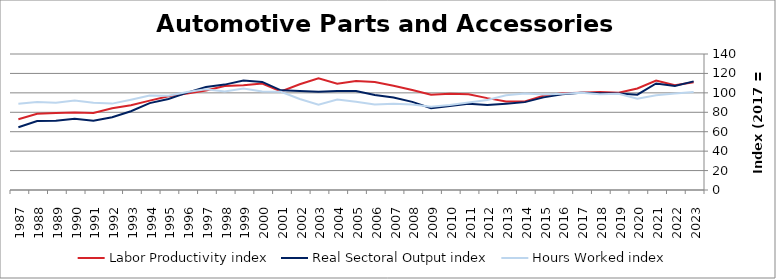
| Category | Labor Productivity index | Real Sectoral Output index | Hours Worked index |
|---|---|---|---|
| 2023.0 | 110.968 | 111.822 | 100.77 |
| 2022.0 | 107.852 | 107.166 | 99.364 |
| 2021.0 | 112.573 | 109.719 | 97.464 |
| 2020.0 | 104.532 | 98.125 | 93.871 |
| 2019.0 | 100.223 | 99.301 | 99.08 |
| 2018.0 | 100.858 | 99.532 | 98.686 |
| 2017.0 | 100 | 100 | 100 |
| 2016.0 | 99.548 | 98.546 | 98.993 |
| 2015.0 | 97.015 | 95.364 | 98.298 |
| 2014.0 | 91.045 | 90.454 | 99.35 |
| 2013.0 | 91.18 | 88.893 | 97.491 |
| 2012.0 | 94.582 | 87.61 | 92.629 |
| 2011.0 | 98.626 | 88.884 | 90.122 |
| 2010.0 | 98.953 | 86.588 | 87.504 |
| 2009.0 | 98.142 | 84.197 | 85.791 |
| 2008.0 | 102.962 | 90.705 | 88.095 |
| 2007.0 | 107.335 | 95.282 | 88.771 |
| 2006.0 | 111.146 | 97.719 | 87.919 |
| 2005.0 | 112.198 | 101.92 | 90.839 |
| 2004.0 | 109.306 | 101.904 | 93.228 |
| 2003.0 | 115.047 | 101.076 | 87.856 |
| 2002.0 | 108.844 | 101.918 | 93.637 |
| 2001.0 | 101.453 | 102.64 | 101.17 |
| 2000.0 | 109.631 | 111.288 | 101.512 |
| 1999.0 | 107.818 | 112.59 | 104.425 |
| 1998.0 | 107.107 | 108.494 | 101.295 |
| 1997.0 | 102.352 | 106.078 | 103.641 |
| 1996.0 | 99.255 | 100.231 | 100.983 |
| 1995.0 | 96.559 | 93.743 | 97.084 |
| 1994.0 | 92.007 | 89.422 | 97.19 |
| 1993.0 | 87.246 | 81.084 | 92.938 |
| 1992.0 | 84.169 | 74.847 | 88.924 |
| 1991.0 | 79.23 | 71.181 | 89.841 |
| 1990.0 | 79.728 | 73.379 | 92.036 |
| 1989.0 | 79.226 | 71.219 | 89.892 |
| 1988.0 | 78.413 | 71.006 | 90.554 |
| 1987.0 | 72.787 | 64.629 | 88.792 |